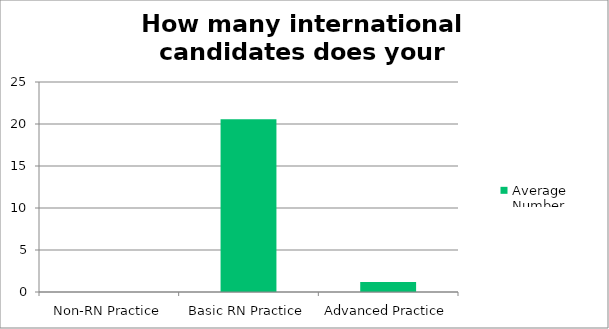
| Category | Average Number |
|---|---|
| Non-RN Practice | 0 |
| Basic RN Practice | 20.556 |
| Advanced Practice | 1.2 |